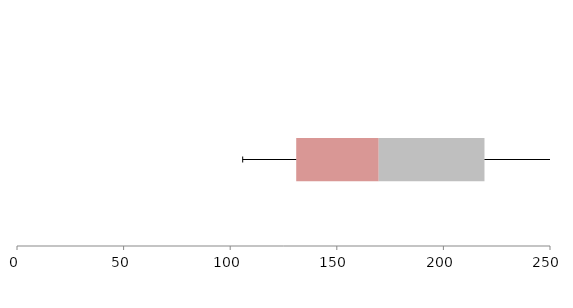
| Category | Series 1 | Series 2 | Series 3 |
|---|---|---|---|
| 0 | 130.962 | 38.703 | 49.604 |